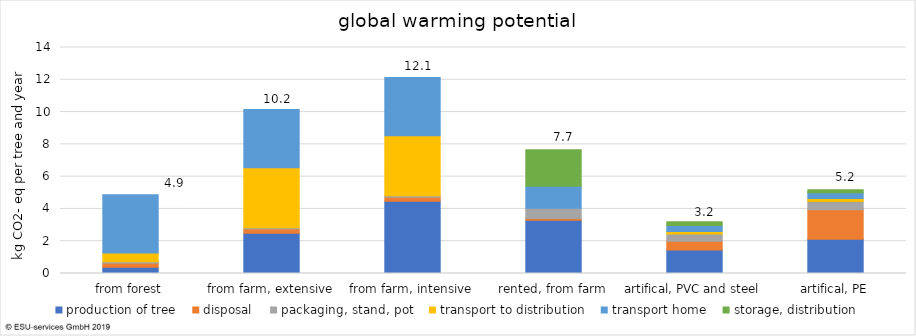
| Category | production of tree | disposal | packaging, stand, pot | transport to distribution | transport home | storage, distribution |
|---|---|---|---|---|---|---|
| from forest | 0.383 | 0.256 | 0.087 | 0.539 | 3.613 | 0 |
| from farm, extensive | 2.494 | 0.256 | 0.087 | 3.717 | 3.613 | 0 |
| from farm, intensive | 4.469 | 0.256 | 0.087 | 3.717 | 3.613 | 0 |
| rented, from farm | 3.292 | 0.12 | 0.625 | 0 | 1.375 | 2.252 |
| artifical, PVC and steel | 1.46 | 0.534 | 0.457 | 0.156 | 0.361 | 0.245 |
| artifical, PE | 2.129 | 1.819 | 0.515 | 0.183 | 0.361 | 0.183 |